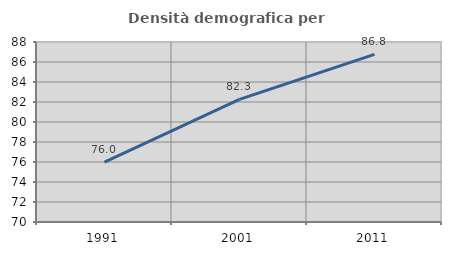
| Category | Densità demografica |
|---|---|
| 1991.0 | 75.977 |
| 2001.0 | 82.255 |
| 2011.0 | 86.767 |